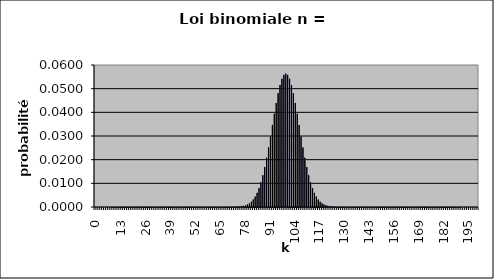
| Category | Series 0 |
|---|---|
| 0.0 | 0 |
| 1.0 | 0 |
| 2.0 | 0 |
| 3.0 | 0 |
| 4.0 | 0 |
| 5.0 | 0 |
| 6.0 | 0 |
| 7.0 | 0 |
| 8.0 | 0 |
| 9.0 | 0 |
| 10.0 | 0 |
| 11.0 | 0 |
| 12.0 | 0 |
| 13.0 | 0 |
| 14.0 | 0 |
| 15.0 | 0 |
| 16.0 | 0 |
| 17.0 | 0 |
| 18.0 | 0 |
| 19.0 | 0 |
| 20.0 | 0 |
| 21.0 | 0 |
| 22.0 | 0 |
| 23.0 | 0 |
| 24.0 | 0 |
| 25.0 | 0 |
| 26.0 | 0 |
| 27.0 | 0 |
| 28.0 | 0 |
| 29.0 | 0 |
| 30.0 | 0 |
| 31.0 | 0 |
| 32.0 | 0 |
| 33.0 | 0 |
| 34.0 | 0 |
| 35.0 | 0 |
| 36.0 | 0 |
| 37.0 | 0 |
| 38.0 | 0 |
| 39.0 | 0 |
| 40.0 | 0 |
| 41.0 | 0 |
| 42.0 | 0 |
| 43.0 | 0 |
| 44.0 | 0 |
| 45.0 | 0 |
| 46.0 | 0 |
| 47.0 | 0 |
| 48.0 | 0 |
| 49.0 | 0 |
| 50.0 | 0 |
| 51.0 | 0 |
| 52.0 | 0 |
| 53.0 | 0 |
| 54.0 | 0 |
| 55.0 | 0 |
| 56.0 | 0 |
| 57.0 | 0 |
| 58.0 | 0 |
| 59.0 | 0 |
| 60.0 | 0 |
| 61.0 | 0 |
| 62.0 | 0 |
| 63.0 | 0 |
| 64.0 | 0 |
| 65.0 | 0 |
| 66.0 | 0 |
| 67.0 | 0 |
| 68.0 | 0 |
| 69.0 | 0 |
| 70.0 | 0 |
| 71.0 | 0 |
| 72.0 | 0 |
| 73.0 | 0 |
| 74.0 | 0 |
| 75.0 | 0 |
| 76.0 | 0 |
| 77.0 | 0 |
| 78.0 | 0 |
| 79.0 | 0.001 |
| 80.0 | 0.001 |
| 81.0 | 0.002 |
| 82.0 | 0.002 |
| 83.0 | 0.003 |
| 84.0 | 0.004 |
| 85.0 | 0.006 |
| 86.0 | 0.008 |
| 87.0 | 0.01 |
| 88.0 | 0.013 |
| 89.0 | 0.017 |
| 90.0 | 0.021 |
| 91.0 | 0.025 |
| 92.0 | 0.03 |
| 93.0 | 0.035 |
| 94.0 | 0.039 |
| 95.0 | 0.044 |
| 96.0 | 0.048 |
| 97.0 | 0.052 |
| 98.0 | 0.054 |
| 99.0 | 0.056 |
| 100.0 | 0.056 |
| 101.0 | 0.056 |
| 102.0 | 0.054 |
| 103.0 | 0.052 |
| 104.0 | 0.048 |
| 105.0 | 0.044 |
| 106.0 | 0.039 |
| 107.0 | 0.035 |
| 108.0 | 0.03 |
| 109.0 | 0.025 |
| 110.0 | 0.021 |
| 111.0 | 0.017 |
| 112.0 | 0.013 |
| 113.0 | 0.01 |
| 114.0 | 0.008 |
| 115.0 | 0.006 |
| 116.0 | 0.004 |
| 117.0 | 0.003 |
| 118.0 | 0.002 |
| 119.0 | 0.002 |
| 120.0 | 0.001 |
| 121.0 | 0.001 |
| 122.0 | 0 |
| 123.0 | 0 |
| 124.0 | 0 |
| 125.0 | 0 |
| 126.0 | 0 |
| 127.0 | 0 |
| 128.0 | 0 |
| 129.0 | 0 |
| 130.0 | 0 |
| 131.0 | 0 |
| 132.0 | 0 |
| 133.0 | 0 |
| 134.0 | 0 |
| 135.0 | 0 |
| 136.0 | 0 |
| 137.0 | 0 |
| 138.0 | 0 |
| 139.0 | 0 |
| 140.0 | 0 |
| 141.0 | 0 |
| 142.0 | 0 |
| 143.0 | 0 |
| 144.0 | 0 |
| 145.0 | 0 |
| 146.0 | 0 |
| 147.0 | 0 |
| 148.0 | 0 |
| 149.0 | 0 |
| 150.0 | 0 |
| 151.0 | 0 |
| 152.0 | 0 |
| 153.0 | 0 |
| 154.0 | 0 |
| 155.0 | 0 |
| 156.0 | 0 |
| 157.0 | 0 |
| 158.0 | 0 |
| 159.0 | 0 |
| 160.0 | 0 |
| 161.0 | 0 |
| 162.0 | 0 |
| 163.0 | 0 |
| 164.0 | 0 |
| 165.0 | 0 |
| 166.0 | 0 |
| 167.0 | 0 |
| 168.0 | 0 |
| 169.0 | 0 |
| 170.0 | 0 |
| 171.0 | 0 |
| 172.0 | 0 |
| 173.0 | 0 |
| 174.0 | 0 |
| 175.0 | 0 |
| 176.0 | 0 |
| 177.0 | 0 |
| 178.0 | 0 |
| 179.0 | 0 |
| 180.0 | 0 |
| 181.0 | 0 |
| 182.0 | 0 |
| 183.0 | 0 |
| 184.0 | 0 |
| 185.0 | 0 |
| 186.0 | 0 |
| 187.0 | 0 |
| 188.0 | 0 |
| 189.0 | 0 |
| 190.0 | 0 |
| 191.0 | 0 |
| 192.0 | 0 |
| 193.0 | 0 |
| 194.0 | 0 |
| 195.0 | 0 |
| 196.0 | 0 |
| 197.0 | 0 |
| 198.0 | 0 |
| 199.0 | 0 |
| 200.0 | 0 |